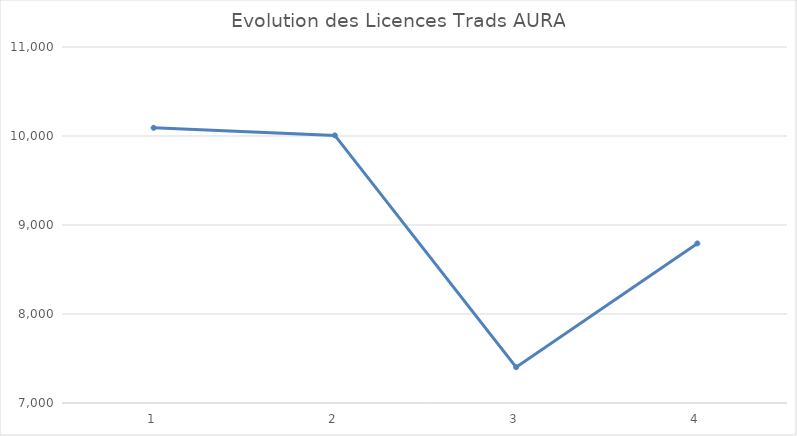
| Category | AURA TRADS |
|---|---|
| 0 | 10092 |
| 1 | 10007 |
| 2 | 7402 |
| 3 | 8793 |